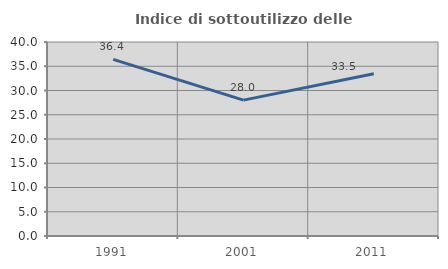
| Category | Indice di sottoutilizzo delle abitazioni  |
|---|---|
| 1991.0 | 36.424 |
| 2001.0 | 28.014 |
| 2011.0 | 33.455 |